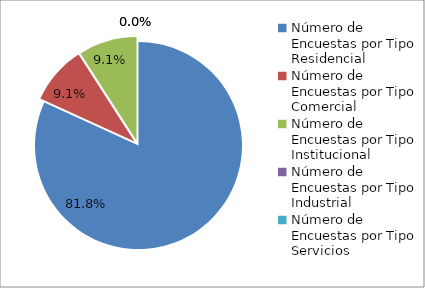
| Category | Series 0 |
|---|---|
| 0 | 144 |
| 1 | 16 |
| 2 | 16 |
| 3 | 0 |
| 4 | 0 |